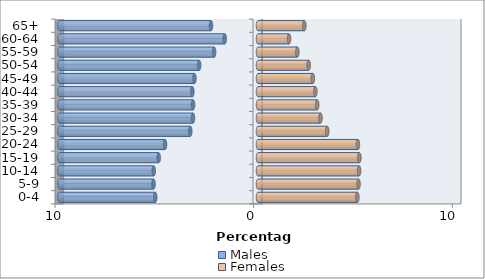
| Category | Males | Females |
|---|---|---|
| 0-4 | -5.174 | 5.002 |
| 5-9 | -5.26 | 5.062 |
| 10-14 | -5.248 | 5.09 |
| 15-19 | -4.999 | 5.102 |
| 20-24 | -4.679 | 5.03 |
| 25-29 | -3.41 | 3.482 |
| 30-34 | -3.274 | 3.145 |
| 35-39 | -3.269 | 2.98 |
| 40-44 | -3.305 | 2.887 |
| 45-49 | -3.2 | 2.76 |
| 50-54 | -2.963 | 2.552 |
| 55-59 | -2.208 | 1.981 |
| 60-64 | -1.675 | 1.563 |
| 65+ | -2.366 | 2.332 |